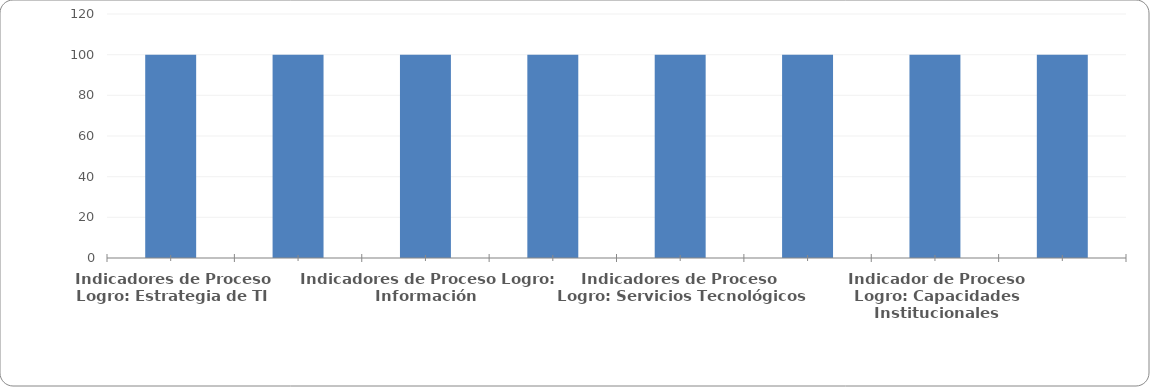
| Category | Series 0 |
|---|---|
| Indicadores de Proceso
Logro: Estrategia de TI | 100 |
| Indicadores de Proceso
Logro: Gobierno de TI | 100 |
| Indicadores de Proceso Logro: Información | 100 |
| Indicadores de Proceso
Logro: Sistemas de Información | 100 |
| Indicadores de Proceso  Logro: Servicios Tecnológicos
 | 100 |
| Indicador de Proceso
Logro: Uso y Apropiación | 100 |
| Indicador de Proceso
Logro: Capacidades Institucionales | 100 |
| Indicadores de resultado TIC para la Gestión  | 100 |